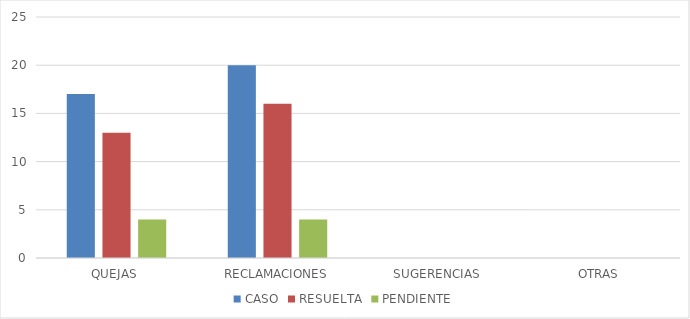
| Category | CASO | RESUELTA | PENDIENTE |
|---|---|---|---|
| QUEJAS | 17 | 13 | 4 |
| RECLAMACIONES | 20 | 16 | 4 |
| SUGERENCIAS | 0 | 0 | 0 |
| OTRAS | 0 | 0 | 0 |